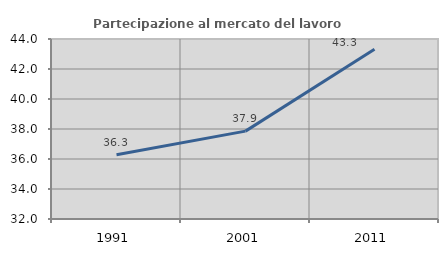
| Category | Partecipazione al mercato del lavoro  femminile |
|---|---|
| 1991.0 | 36.284 |
| 2001.0 | 37.859 |
| 2011.0 | 43.316 |